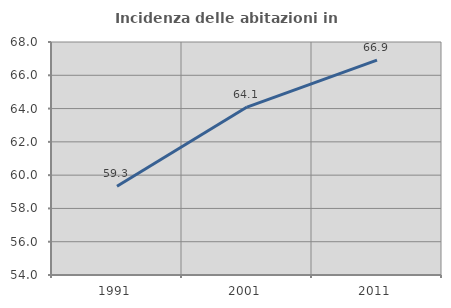
| Category | Incidenza delle abitazioni in proprietà  |
|---|---|
| 1991.0 | 59.328 |
| 2001.0 | 64.089 |
| 2011.0 | 66.91 |